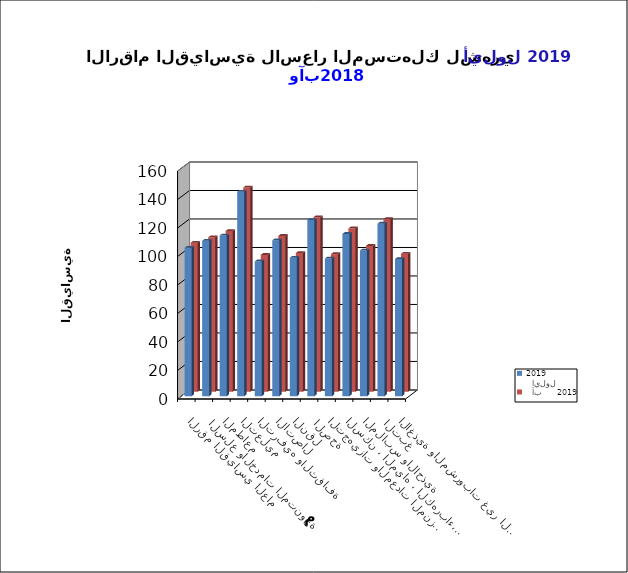
| Category |   ايلول     2019      |   آب     2019      |
|---|---|---|
| الاغذية والمشروبات غير الكحولية | 96.3 | 96.8 |
|  التبغ | 121.1 | 121.1 |
| الملابس والاحذية | 102.3 | 102.3 |
| السكن ، المياه ، الكهرباء، الغاز  | 113.9 | 114.6 |
| التجهيزات والمعدات المنزلية والصيانة | 96.6 | 96.5 |
|  الصحة | 123.6 | 122.4 |
| النقل | 97.2 | 97.3 |
| الاتصال | 109.4 | 109.3 |
| الترفيه والثقافة | 94.6 | 96 |
| التعليم | 143.5 | 143.3 |
| المطاعم  | 112.8 | 112.8 |
|  السلع والخدمات المتنوعة | 109.1 | 108.3 |
| الرقم القياسي العام | 104.2 | 104.5 |